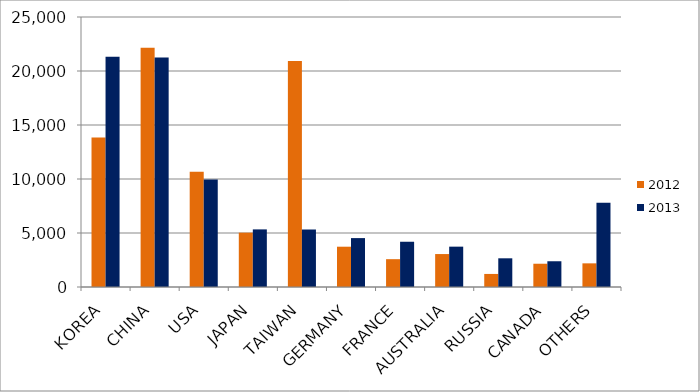
| Category | 2012 | 2013 |
|---|---|---|
| KOREA | 13848 | 21330 |
| CHINA | 22150 | 21253 |
| USA | 10664 | 9962 |
| JAPAN | 5031 | 5334 |
| TAIWAN | 20933 | 5324 |
| GERMANY | 3731 | 4528 |
| FRANCE | 2576 | 4190 |
| AUSTRALIA | 3051 | 3736 |
| RUSSIA | 1209 | 2657 |
| CANADA | 2154 | 2384 |
| OTHERS | 2190 | 7801 |